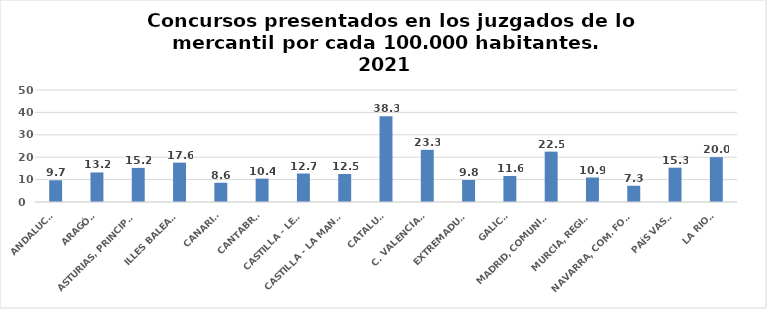
| Category | Series 0 |
|---|---|
| ANDALUCÍA | 9.697 |
| ARAGÓN | 13.195 |
| ASTURIAS, PRINCIPADO | 15.221 |
| ILLES BALEARS | 17.562 |
| CANARIAS | 8.606 |
| CANTABRIA | 10.436 |
| CASTILLA - LEÓN | 12.714 |
| CASTILLA - LA MANCHA | 12.49 |
| CATALUÑA | 38.334 |
| C. VALENCIANA | 23.289 |
| EXTREMADURA | 9.816 |
| GALICIA | 11.611 |
| MADRID, COMUNIDAD | 22.485 |
| MURCIA, REGIÓN | 10.932 |
| NAVARRA, COM. FORAL | 7.256 |
| PAÍS VASCO | 15.312 |
| LA RIOJA | 20.013 |